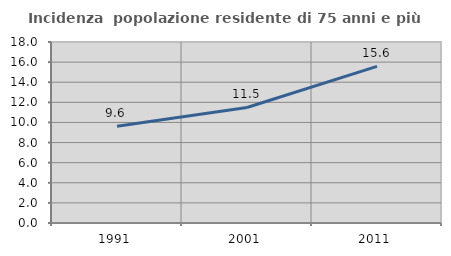
| Category | Incidenza  popolazione residente di 75 anni e più |
|---|---|
| 1991.0 | 9.629 |
| 2001.0 | 11.49 |
| 2011.0 | 15.573 |